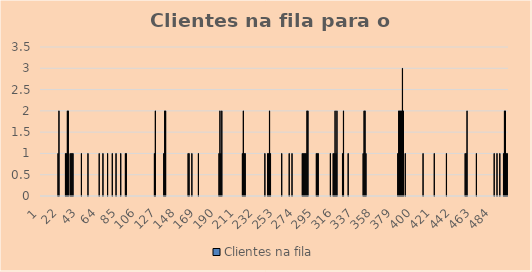
| Category | Clientes na fila |
|---|---|
| 1.0 | 0 |
| 2.0 | 0 |
| 3.0 | 0 |
| 4.0 | 0 |
| 5.0 | 0 |
| 6.0 | 0 |
| 7.0 | 0 |
| 8.0 | 0 |
| 9.0 | 0 |
| 10.0 | 0 |
| 11.0 | 0 |
| 12.0 | 0 |
| 13.0 | 0 |
| 14.0 | 0 |
| 15.0 | 0 |
| 16.0 | 0 |
| 17.0 | 0 |
| 18.0 | 0 |
| 19.0 | 0 |
| 20.0 | 1 |
| 21.0 | 2 |
| 22.0 | 0 |
| 23.0 | 0 |
| 24.0 | 0 |
| 25.0 | 0 |
| 26.0 | 0 |
| 27.0 | 0 |
| 28.0 | 1 |
| 29.0 | 1 |
| 30.0 | 2 |
| 31.0 | 2 |
| 32.0 | 0 |
| 33.0 | 1 |
| 34.0 | 1 |
| 35.0 | 1 |
| 36.0 | 1 |
| 37.0 | 0 |
| 38.0 | 0 |
| 39.0 | 0 |
| 40.0 | 0 |
| 41.0 | 0 |
| 42.0 | 0 |
| 43.0 | 0 |
| 44.0 | 0 |
| 45.0 | 1 |
| 46.0 | 0 |
| 47.0 | 0 |
| 48.0 | 0 |
| 49.0 | 0 |
| 50.0 | 0 |
| 51.0 | 0 |
| 52.0 | 1 |
| 53.0 | 0 |
| 54.0 | 0 |
| 55.0 | 0 |
| 56.0 | 0 |
| 57.0 | 0 |
| 58.0 | 0 |
| 59.0 | 0 |
| 60.0 | 0 |
| 61.0 | 0 |
| 62.0 | 0 |
| 63.0 | 0 |
| 64.0 | 1 |
| 65.0 | 0 |
| 66.0 | 0 |
| 67.0 | 0 |
| 68.0 | 1 |
| 69.0 | 0 |
| 70.0 | 0 |
| 71.0 | 0 |
| 72.0 | 0 |
| 73.0 | 1 |
| 74.0 | 0 |
| 75.0 | 0 |
| 76.0 | 0 |
| 77.0 | 0 |
| 78.0 | 1 |
| 79.0 | 0 |
| 80.0 | 0 |
| 81.0 | 0 |
| 82.0 | 1 |
| 83.0 | 0 |
| 84.0 | 0 |
| 85.0 | 0 |
| 86.0 | 0 |
| 87.0 | 1 |
| 88.0 | 0 |
| 89.0 | 0 |
| 90.0 | 0 |
| 91.0 | 0 |
| 92.0 | 1 |
| 93.0 | 1 |
| 94.0 | 0 |
| 95.0 | 0 |
| 96.0 | 0 |
| 97.0 | 0 |
| 98.0 | 0 |
| 99.0 | 0 |
| 100.0 | 0 |
| 101.0 | 0 |
| 102.0 | 0 |
| 103.0 | 0 |
| 104.0 | 0 |
| 105.0 | 0 |
| 106.0 | 0 |
| 107.0 | 0 |
| 108.0 | 0 |
| 109.0 | 0 |
| 110.0 | 0 |
| 111.0 | 0 |
| 112.0 | 0 |
| 113.0 | 0 |
| 114.0 | 0 |
| 115.0 | 0 |
| 116.0 | 0 |
| 117.0 | 0 |
| 118.0 | 0 |
| 119.0 | 0 |
| 120.0 | 0 |
| 121.0 | 0 |
| 122.0 | 0 |
| 123.0 | 1 |
| 124.0 | 2 |
| 125.0 | 0 |
| 126.0 | 0 |
| 127.0 | 0 |
| 128.0 | 0 |
| 129.0 | 0 |
| 130.0 | 0 |
| 131.0 | 0 |
| 132.0 | 0 |
| 133.0 | 1 |
| 134.0 | 2 |
| 135.0 | 2 |
| 136.0 | 0 |
| 137.0 | 0 |
| 138.0 | 0 |
| 139.0 | 0 |
| 140.0 | 0 |
| 141.0 | 0 |
| 142.0 | 0 |
| 143.0 | 0 |
| 144.0 | 0 |
| 145.0 | 0 |
| 146.0 | 0 |
| 147.0 | 0 |
| 148.0 | 0 |
| 149.0 | 0 |
| 150.0 | 0 |
| 151.0 | 0 |
| 152.0 | 0 |
| 153.0 | 0 |
| 154.0 | 0 |
| 155.0 | 0 |
| 156.0 | 0 |
| 157.0 | 0 |
| 158.0 | 0 |
| 159.0 | 1 |
| 160.0 | 1 |
| 161.0 | 0 |
| 162.0 | 0 |
| 163.0 | 1 |
| 164.0 | 0 |
| 165.0 | 0 |
| 166.0 | 0 |
| 167.0 | 0 |
| 168.0 | 0 |
| 169.0 | 0 |
| 170.0 | 1 |
| 171.0 | 0 |
| 172.0 | 0 |
| 173.0 | 0 |
| 174.0 | 0 |
| 175.0 | 0 |
| 176.0 | 0 |
| 177.0 | 0 |
| 178.0 | 0 |
| 179.0 | 0 |
| 180.0 | 0 |
| 181.0 | 0 |
| 182.0 | 0 |
| 183.0 | 0 |
| 184.0 | 0 |
| 185.0 | 0 |
| 186.0 | 0 |
| 187.0 | 0 |
| 188.0 | 0 |
| 189.0 | 0 |
| 190.0 | 0 |
| 191.0 | 0 |
| 192.0 | 1 |
| 193.0 | 2 |
| 194.0 | 1 |
| 195.0 | 2 |
| 196.0 | 0 |
| 197.0 | 0 |
| 198.0 | 0 |
| 199.0 | 0 |
| 200.0 | 0 |
| 201.0 | 0 |
| 202.0 | 0 |
| 203.0 | 0 |
| 204.0 | 0 |
| 205.0 | 0 |
| 206.0 | 0 |
| 207.0 | 0 |
| 208.0 | 0 |
| 209.0 | 0 |
| 210.0 | 0 |
| 211.0 | 0 |
| 212.0 | 0 |
| 213.0 | 0 |
| 214.0 | 0 |
| 215.0 | 0 |
| 216.0 | 0 |
| 217.0 | 1 |
| 218.0 | 2 |
| 219.0 | 1 |
| 220.0 | 1 |
| 221.0 | 0 |
| 222.0 | 0 |
| 223.0 | 0 |
| 224.0 | 0 |
| 225.0 | 0 |
| 226.0 | 0 |
| 227.0 | 0 |
| 228.0 | 0 |
| 229.0 | 0 |
| 230.0 | 0 |
| 231.0 | 0 |
| 232.0 | 0 |
| 233.0 | 0 |
| 234.0 | 0 |
| 235.0 | 0 |
| 236.0 | 0 |
| 237.0 | 0 |
| 238.0 | 0 |
| 239.0 | 0 |
| 240.0 | 0 |
| 241.0 | 1 |
| 242.0 | 0 |
| 243.0 | 0 |
| 244.0 | 1 |
| 245.0 | 1 |
| 246.0 | 2 |
| 247.0 | 1 |
| 248.0 | 0 |
| 249.0 | 0 |
| 250.0 | 0 |
| 251.0 | 0 |
| 252.0 | 0 |
| 253.0 | 0 |
| 254.0 | 0 |
| 255.0 | 0 |
| 256.0 | 0 |
| 257.0 | 0 |
| 258.0 | 0 |
| 259.0 | 1 |
| 260.0 | 0 |
| 261.0 | 0 |
| 262.0 | 0 |
| 263.0 | 0 |
| 264.0 | 0 |
| 265.0 | 0 |
| 266.0 | 0 |
| 267.0 | 1 |
| 268.0 | 0 |
| 269.0 | 0 |
| 270.0 | 1 |
| 271.0 | 0 |
| 272.0 | 0 |
| 273.0 | 0 |
| 274.0 | 0 |
| 275.0 | 0 |
| 276.0 | 0 |
| 277.0 | 0 |
| 278.0 | 0 |
| 279.0 | 0 |
| 280.0 | 0 |
| 281.0 | 1 |
| 282.0 | 1 |
| 283.0 | 1 |
| 284.0 | 1 |
| 285.0 | 1 |
| 286.0 | 2 |
| 287.0 | 2 |
| 288.0 | 0 |
| 289.0 | 0 |
| 290.0 | 0 |
| 291.0 | 0 |
| 292.0 | 0 |
| 293.0 | 0 |
| 294.0 | 0 |
| 295.0 | 0 |
| 296.0 | 1 |
| 297.0 | 1 |
| 298.0 | 1 |
| 299.0 | 0 |
| 300.0 | 0 |
| 301.0 | 0 |
| 302.0 | 0 |
| 303.0 | 0 |
| 304.0 | 0 |
| 305.0 | 0 |
| 306.0 | 0 |
| 307.0 | 0 |
| 308.0 | 0 |
| 309.0 | 0 |
| 310.0 | 0 |
| 311.0 | 1 |
| 312.0 | 0 |
| 313.0 | 0 |
| 314.0 | 1 |
| 315.0 | 1 |
| 316.0 | 2 |
| 317.0 | 1 |
| 318.0 | 2 |
| 319.0 | 0 |
| 320.0 | 0 |
| 321.0 | 0 |
| 322.0 | 0 |
| 323.0 | 0 |
| 324.0 | 1 |
| 325.0 | 2 |
| 326.0 | 0 |
| 327.0 | 0 |
| 328.0 | 0 |
| 329.0 | 0 |
| 330.0 | 1 |
| 331.0 | 0 |
| 332.0 | 0 |
| 333.0 | 0 |
| 334.0 | 0 |
| 335.0 | 0 |
| 336.0 | 0 |
| 337.0 | 0 |
| 338.0 | 0 |
| 339.0 | 0 |
| 340.0 | 0 |
| 341.0 | 0 |
| 342.0 | 0 |
| 343.0 | 0 |
| 344.0 | 0 |
| 345.0 | 0 |
| 346.0 | 1 |
| 347.0 | 2 |
| 348.0 | 2 |
| 349.0 | 1 |
| 350.0 | 0 |
| 351.0 | 0 |
| 352.0 | 0 |
| 353.0 | 0 |
| 354.0 | 0 |
| 355.0 | 0 |
| 356.0 | 0 |
| 357.0 | 0 |
| 358.0 | 0 |
| 359.0 | 0 |
| 360.0 | 0 |
| 361.0 | 0 |
| 362.0 | 0 |
| 363.0 | 0 |
| 364.0 | 0 |
| 365.0 | 0 |
| 366.0 | 0 |
| 367.0 | 0 |
| 368.0 | 0 |
| 369.0 | 0 |
| 370.0 | 0 |
| 371.0 | 0 |
| 372.0 | 0 |
| 373.0 | 0 |
| 374.0 | 0 |
| 375.0 | 0 |
| 376.0 | 0 |
| 377.0 | 0 |
| 378.0 | 0 |
| 379.0 | 0 |
| 380.0 | 0 |
| 381.0 | 0 |
| 382.0 | 0 |
| 383.0 | 1 |
| 384.0 | 2 |
| 385.0 | 2 |
| 386.0 | 2 |
| 387.0 | 2 |
| 388.0 | 3 |
| 389.0 | 2 |
| 390.0 | 0 |
| 391.0 | 1 |
| 392.0 | 0 |
| 393.0 | 0 |
| 394.0 | 0 |
| 395.0 | 0 |
| 396.0 | 0 |
| 397.0 | 0 |
| 398.0 | 0 |
| 399.0 | 0 |
| 400.0 | 0 |
| 401.0 | 0 |
| 402.0 | 0 |
| 403.0 | 0 |
| 404.0 | 0 |
| 405.0 | 0 |
| 406.0 | 0 |
| 407.0 | 0 |
| 408.0 | 0 |
| 409.0 | 0 |
| 410.0 | 1 |
| 411.0 | 0 |
| 412.0 | 0 |
| 413.0 | 0 |
| 414.0 | 0 |
| 415.0 | 0 |
| 416.0 | 0 |
| 417.0 | 0 |
| 418.0 | 0 |
| 419.0 | 0 |
| 420.0 | 0 |
| 421.0 | 0 |
| 422.0 | 1 |
| 423.0 | 0 |
| 424.0 | 0 |
| 425.0 | 0 |
| 426.0 | 0 |
| 427.0 | 0 |
| 428.0 | 0 |
| 429.0 | 0 |
| 430.0 | 0 |
| 431.0 | 0 |
| 432.0 | 0 |
| 433.0 | 0 |
| 434.0 | 0 |
| 435.0 | 1 |
| 436.0 | 0 |
| 437.0 | 0 |
| 438.0 | 0 |
| 439.0 | 0 |
| 440.0 | 0 |
| 441.0 | 0 |
| 442.0 | 0 |
| 443.0 | 0 |
| 444.0 | 0 |
| 445.0 | 0 |
| 446.0 | 0 |
| 447.0 | 0 |
| 448.0 | 0 |
| 449.0 | 0 |
| 450.0 | 0 |
| 451.0 | 0 |
| 452.0 | 0 |
| 453.0 | 0 |
| 454.0 | 0 |
| 455.0 | 1 |
| 456.0 | 1 |
| 457.0 | 2 |
| 458.0 | 0 |
| 459.0 | 0 |
| 460.0 | 0 |
| 461.0 | 0 |
| 462.0 | 0 |
| 463.0 | 0 |
| 464.0 | 0 |
| 465.0 | 0 |
| 466.0 | 0 |
| 467.0 | 1 |
| 468.0 | 0 |
| 469.0 | 0 |
| 470.0 | 0 |
| 471.0 | 0 |
| 472.0 | 0 |
| 473.0 | 0 |
| 474.0 | 0 |
| 475.0 | 0 |
| 476.0 | 0 |
| 477.0 | 0 |
| 478.0 | 0 |
| 479.0 | 0 |
| 480.0 | 0 |
| 481.0 | 0 |
| 482.0 | 0 |
| 483.0 | 0 |
| 484.0 | 0 |
| 485.0 | 0 |
| 486.0 | 1 |
| 487.0 | 0 |
| 488.0 | 0 |
| 489.0 | 1 |
| 490.0 | 0 |
| 491.0 | 0 |
| 492.0 | 1 |
| 493.0 | 0 |
| 494.0 | 0 |
| 495.0 | 0 |
| 496.0 | 1 |
| 497.0 | 2 |
| 498.0 | 2 |
| 499.0 | 1 |
| 500.0 | 1 |